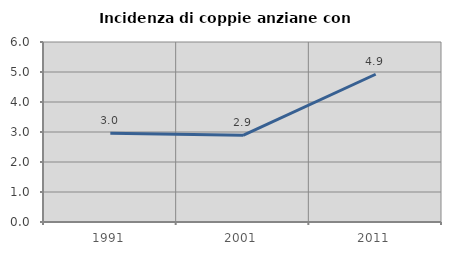
| Category | Incidenza di coppie anziane con figli |
|---|---|
| 1991.0 | 2.954 |
| 2001.0 | 2.891 |
| 2011.0 | 4.925 |